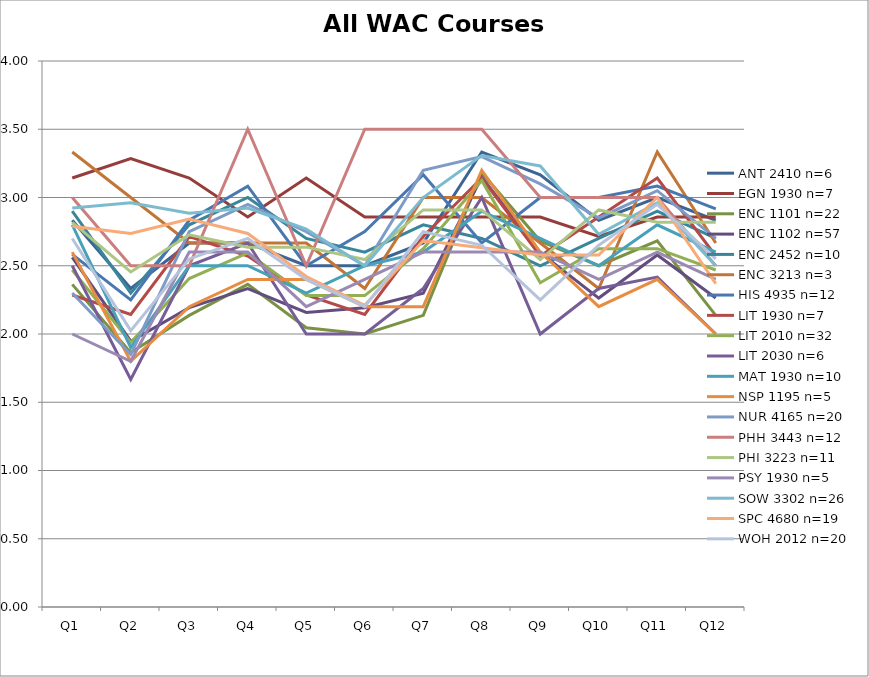
| Category | ANT 2410 n=6 | EGN 1930 n=7 | ENC 1101 n=22 | ENC 1102 n=57 | ENC 2452 n=10 | ENC 3213 n=3 | HIS 4935 n=12 | LIT 1930 n=7 | LIT 2010 n=32 | LIT 2030 n=6 | MAT 1930 n=10 | NSP 1195 n=5 | NUR 4165 n=20 | PHH 3443 n=12 | PHI 3223 n=11 | PSY 1930 n=5 | SOW 3302 n=26 | SPC 4680 n=19 | WOH 2012 n=20 |
|---|---|---|---|---|---|---|---|---|---|---|---|---|---|---|---|---|---|---|---|
| Q1 | 2.833 | 3.143 | 2.364 | 2.561 | 2.9 | 3.333 | 2.583 | 2.286 | 2.469 | 2.5 | 2.8 | 2.6 | 2.3 | 3 | 2.818 | 2 | 2.923 | 2.789 | 2.7 |
| Q2 | 2.333 | 3.286 | 1.864 | 1.947 | 2.3 | 3 | 2.25 | 2.143 | 1.938 | 1.667 | 1.9 | 1.8 | 1.85 | 2.5 | 2.455 | 1.8 | 2.962 | 2.737 | 2.025 |
| Q3 | 2.667 | 3.143 | 2.136 | 2.193 | 2.8 | 2.667 | 2.833 | 2.714 | 2.406 | 2.5 | 2.5 | 2.2 | 2.75 | 2.5 | 2.727 | 2.6 | 2.885 | 2.842 | 2.55 |
| Q4 | 2.667 | 2.857 | 2.364 | 2.333 | 3 | 2.667 | 3.083 | 2.571 | 2.594 | 2.667 | 2.5 | 2.4 | 2.95 | 3.5 | 2.636 | 2.6 | 2.923 | 2.737 | 2.7 |
| Q5 | 2.5 | 3.143 | 2.045 | 2.158 | 2.7 | 2.667 | 2.5 | 2.286 | 2.281 | 2 | 2.3 | 2.4 | 2.75 | 2.5 | 2.636 | 2.2 | 2.769 | 2.421 | 2.4 |
| Q6 | 2.5 | 2.857 | 2 | 2.193 | 2.6 | 2.333 | 2.75 | 2.143 | 2.281 | 2 | 2.5 | 2.2 | 2.5 | 3.5 | 2.545 | 2.4 | 2.5 | 2.211 | 2.2 |
| Q7 | 2.667 | 2.857 | 2.136 | 2.298 | 2.8 | 3 | 3.167 | 2.714 | 2.625 | 2.333 | 2.6 | 2.2 | 3.2 | 3.5 | 2.909 | 2.6 | 3 | 2.684 | 2.75 |
| Q8 | 3.333 | 2.857 | 3.182 | 3.149 | 2.7 | 3 | 2.667 | 3.143 | 3.125 | 3 | 2.9 | 3.2 | 3.3 | 3.5 | 2.909 | 2.6 | 3.308 | 2.632 | 2.65 |
| Q9 | 3.167 | 2.857 | 2.682 | 2.596 | 2.5 | 2.667 | 3 | 2.571 | 2.375 | 2 | 2.7 | 2.6 | 3.1 | 3 | 2.545 | 2.6 | 3.231 | 2.579 | 2.25 |
| Q10 | 2.833 | 2.714 | 2.5 | 2.263 | 2.7 | 2.333 | 3 | 2.857 | 2.625 | 2.333 | 2.5 | 2.2 | 2.85 | 3 | 2.909 | 2.4 | 2.731 | 2.579 | 2.65 |
| Q11 | 3 | 2.857 | 2.682 | 2.579 | 2.9 | 3.333 | 3.083 | 3.143 | 2.625 | 2.417 | 2.8 | 2.4 | 3.05 | 3 | 2.818 | 2.6 | 2.962 | 3 | 2.95 |
| Q12 | 2.833 | 2.857 | 2.136 | 2.263 | 2.7 | 2.667 | 2.917 | 2.571 | 2.469 | 2 | 2.6 | 2 | 2.7 | 2.5 | 2.818 | 2.4 | 2.5 | 2.368 | 2.55 |